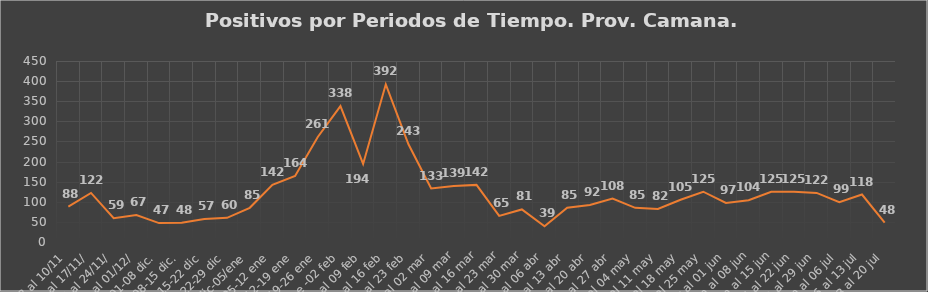
| Category | Prov. Camana  |
|---|---|
| 03 al 10/11 | 88 |
| 10 al 17/11/ | 122 |
|  17 al 24/11/ | 59 |
|  24/11 al 01/12/ | 67 |
| 01-08 dic. | 47 |
| 08-15 dic. | 48 |
| 15-22 dic | 57 |
| 22-29 dic | 60 |
| 29 dic-05/ene | 85 |
| 05-12 ene | 142 |
| 12-19 ene | 164 |
| 19-26 ene | 261 |
| 26 ene -02 feb | 338 |
| 02 al 09 feb | 194 |
| 09 al 16 feb | 392 |
| 16 al 23 feb | 243 |
| 23 feb al 02 mar | 133 |
|  02 al 09 mar | 139 |
|  09 al 16 mar | 142 |
|  16 al 23 mar | 65 |
|  23 al 30 mar | 81 |
|  30 mar al 06 abr | 39 |
| 06 al 13 abr | 85 |
| 13 al 20 abr | 92 |
| 20 al 27 abr | 108 |
| 27 abr al 04 may | 85 |
|  04 al 11 may | 82 |
|  11 al 18 may | 105 |
|  18 al 25 may | 125 |
|   25 may al 01 jun | 97 |
|   01 jun al 08 jun | 104 |
|   08 jun al 15 jun | 125 |
|   15 al 22 jun  | 125 |
|   22 al 29 jun  | 122 |
|  29 jun al 06 jul  | 99 |
|   06 al 13 jul  | 118 |
|   13 al 20 jul  | 48 |